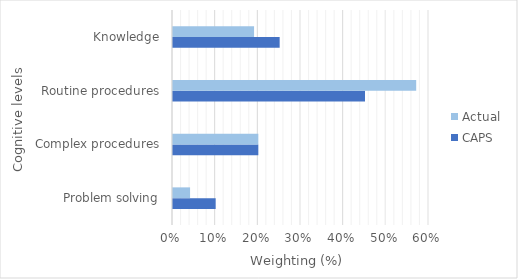
| Category | CAPS | Actual |
|---|---|---|
| Problem solving | 0.1 | 0.04 |
| Complex procedures | 0.2 | 0.2 |
| Routine procedures | 0.45 | 0.57 |
| Knowledge | 0.25 | 0.19 |